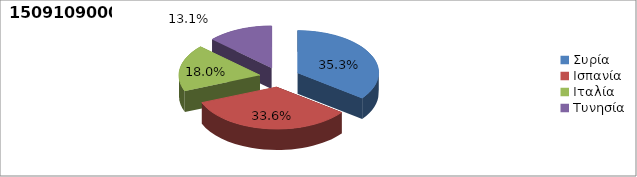
| Category | Series 0 |
|---|---|
| Συρία | 0.353 |
| Ισπανία | 0.336 |
| Ιταλία | 0.18 |
| Τυνησία | 0.131 |